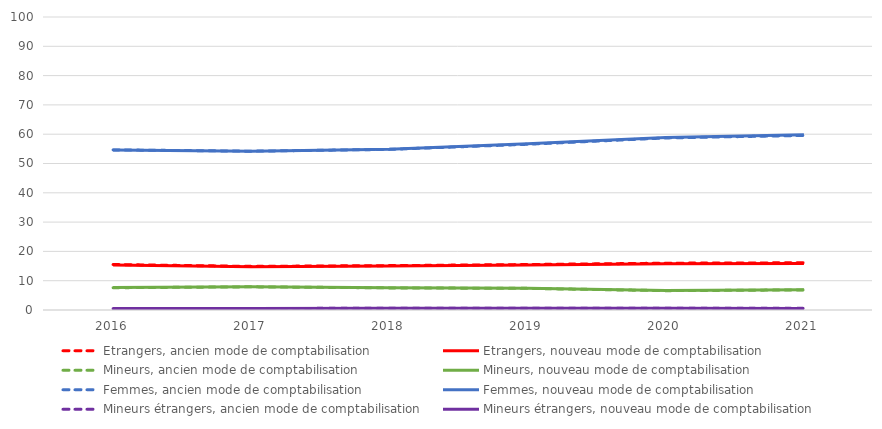
| Category | Etrangers, ancien mode de comptabilisation | Etrangers, nouveau mode de comptabilisation | Mineurs, ancien mode de comptabilisation | Mineurs, nouveau mode de comptabilisation | Femmes, ancien mode de comptabilisation | Femmes, nouveau mode de comptabilisation | Mineurs étrangers, ancien mode de comptabilisation | Mineurs étrangers, nouveau mode de comptabilisation |
|---|---|---|---|---|---|---|---|---|
| 2016.0 | 15.52 | 15.4 | 7.6 | 7.64 | 54.65 | 54.61 | 0.48 | 0.48 |
| 2017.0 | 14.89 | 14.78 | 7.91 | 7.95 | 54.2 | 54.22 | 0.52 | 0.52 |
| 2018.0 | 15.15 | 15.02 | 7.55 | 7.59 | 54.82 | 54.87 | 0.59 | 0.59 |
| 2019.0 | 15.52 | 15.37 | 7.38 | 7.41 | 56.56 | 56.7 | 0.61 | 0.6 |
| 2020.0 | 15.98 | 15.78 | 6.59 | 6.63 | 58.72 | 58.89 | 0.57 | 0.56 |
| 2021.0 | 16.12 | 15.91 | 6.86 | 6.92 | 59.58 | 59.79 | 0.56 | 0.55 |